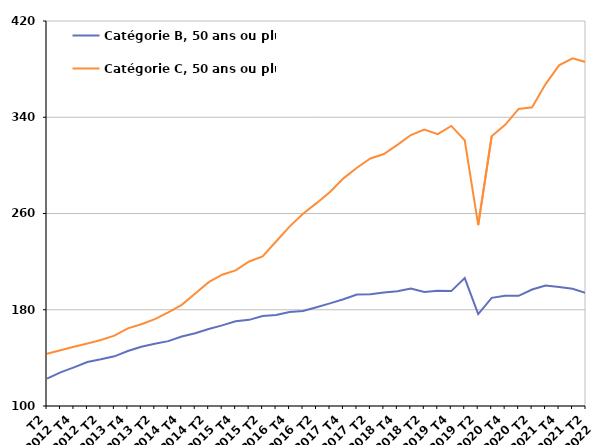
| Category | Catégorie B, 50 ans ou plus | Catégorie C, 50 ans ou plus |
|---|---|---|
| T2
2012 | 122.8 | 143.4 |
| T3
2012 | 128 | 146.4 |
| T4
2012 | 132.1 | 149.2 |
| T1
2013 | 136.6 | 151.9 |
| T2
2013 | 138.8 | 154.8 |
| T3
2013 | 141.3 | 158.5 |
| T4
2013 | 145.7 | 164.5 |
| T1
2014 | 149.2 | 167.9 |
| T2
2014 | 151.8 | 172.2 |
| T3
2014 | 153.9 | 177.8 |
| T4
2014 | 157.8 | 184.1 |
| T1
2015 | 160.5 | 193.5 |
| T2
2015 | 164 | 202.9 |
| T3
2015 | 167 | 209.1 |
| T4
2015 | 170.4 | 212.7 |
| T1
2016 | 171.6 | 220.1 |
| T2
2016 | 174.8 | 224.3 |
| T3
2016 | 175.6 | 236.7 |
| T4
2016 | 178.2 | 249.1 |
| T1
2017 | 179 | 259.8 |
| T2
2017 | 182.1 | 268.6 |
| T3
2017 | 185.3 | 277.9 |
| T4
2017 | 188.7 | 289.2 |
| T1
2018 | 192.7 | 298 |
| T2
2018 | 192.8 | 305.7 |
| T3
2018 | 194.3 | 309.4 |
| T4
2018 | 195.4 | 317 |
| T1
2019 | 197.6 | 325.2 |
| T2
2019 | 194.8 | 329.7 |
| T3
2019 | 195.8 | 325.9 |
| T4
2019 | 195.5 | 332.8 |
| T1
2020 | 206.3 | 320.9 |
| T2
2020 | 176.4 | 250.3 |
| T3
2020 | 189.9 | 324.2 |
| T4
2020 | 191.6 | 333.7 |
| T1
2021 | 191.6 | 346.9 |
| T2
2021 | 196.8 | 348.3 |
| T3
2021 | 200.1 | 367.6 |
| T4
2021 | 199 | 383.1 |
| T1
2022 | 197.5 | 389 |
| T2
2022 | 193.8 | 385.8 |